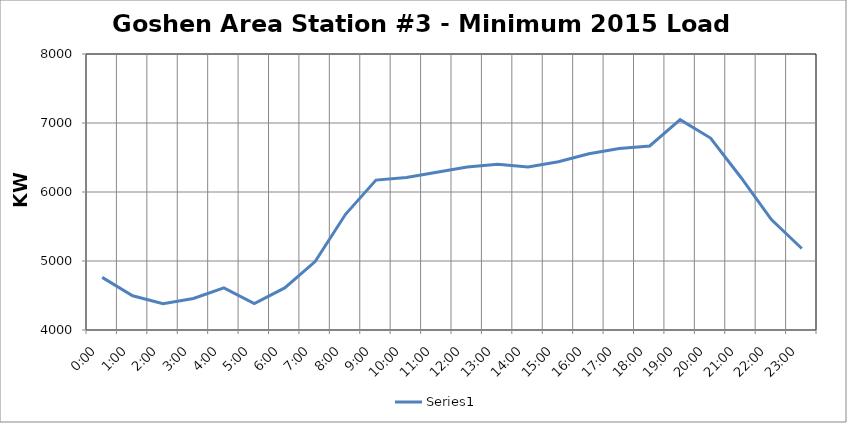
| Category | Series 0 |
|---|---|
| 0.0 | 4762.5 |
| 0.041666666666666664 | 4495.8 |
| 0.08333333333333333 | 4381.5 |
| 0.125 | 4457.7 |
| 0.16666666666666666 | 4610.1 |
| 0.20833333333333334 | 4381.5 |
| 0.25 | 4610.1 |
| 0.2916666666666667 | 4991.1 |
| 0.3333333333333333 | 5676.9 |
| 0.375 | 6172.2 |
| 0.4166666666666667 | 6210.3 |
| 0.4583333333333333 | 6286.5 |
| 0.5 | 6362.7 |
| 0.5416666666666666 | 6400.8 |
| 0.5833333333333334 | 6362.7 |
| 0.625 | 6438.9 |
| 0.6666666666666666 | 6553.2 |
| 0.7083333333333334 | 6629.4 |
| 0.75 | 6667.5 |
| 0.7916666666666666 | 7048.5 |
| 0.8333333333333334 | 6781.8 |
| 0.875 | 6210.3 |
| 0.9166666666666666 | 5600.7 |
| 0.9583333333333334 | 5181.6 |